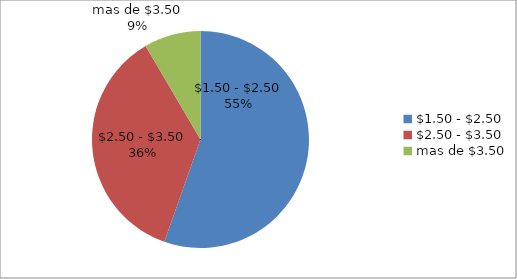
| Category | Series 0 |
|---|---|
| $1.50 - $2.50 | 210 |
| $2.50 - $3.50 | 137 |
| mas de $3.50 | 32 |